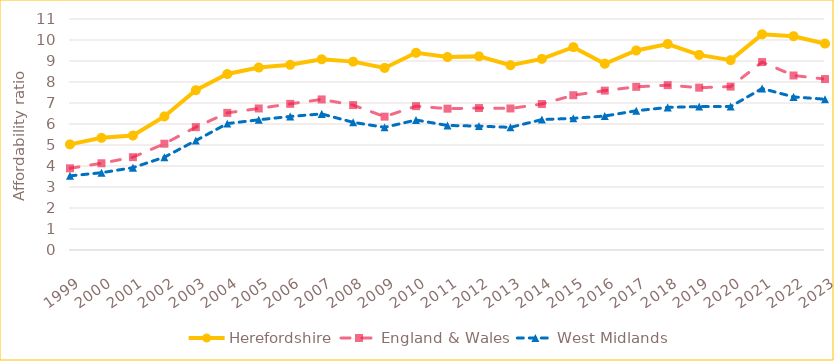
| Category | Herefordshire | England & Wales | West Midlands |
|---|---|---|---|
| 1999 | 5.03 | 3.89 | 3.53 |
| 2000 | 5.34 | 4.13 | 3.68 |
| 2001 | 5.45 | 4.42 | 3.92 |
| 2002 | 6.36 | 5.06 | 4.42 |
| 2003 | 7.61 | 5.85 | 5.21 |
| 2004 | 8.38 | 6.53 | 6.02 |
| 2005 | 8.69 | 6.74 | 6.2 |
| 2006 | 8.82 | 6.96 | 6.36 |
| 2007 | 9.08 | 7.17 | 6.48 |
| 2008 | 8.97 | 6.9 | 6.08 |
| 2009 | 8.67 | 6.35 | 5.84 |
| 2010 | 9.39 | 6.85 | 6.19 |
| 2011 | 9.19 | 6.73 | 5.93 |
| 2012 | 9.22 | 6.76 | 5.9 |
| 2013 | 8.8 | 6.74 | 5.84 |
| 2014 | 9.1 | 6.95 | 6.21 |
| 2015 | 9.66 | 7.37 | 6.27 |
| 2016 | 8.87 | 7.59 | 6.38 |
| 2017 | 9.5 | 7.77 | 6.63 |
| 2018 | 9.81 | 7.85 | 6.79 |
| 2019 | 9.29 | 7.73 | 6.83 |
| 2020 | 9.04 | 7.78 | 6.83 |
| 2021 | 10.27 | 8.95 | 7.69 |
| 2022 | 10.18 | 8.31 | 7.29 |
| 2023 | 9.83 | 8.14 | 7.18 |